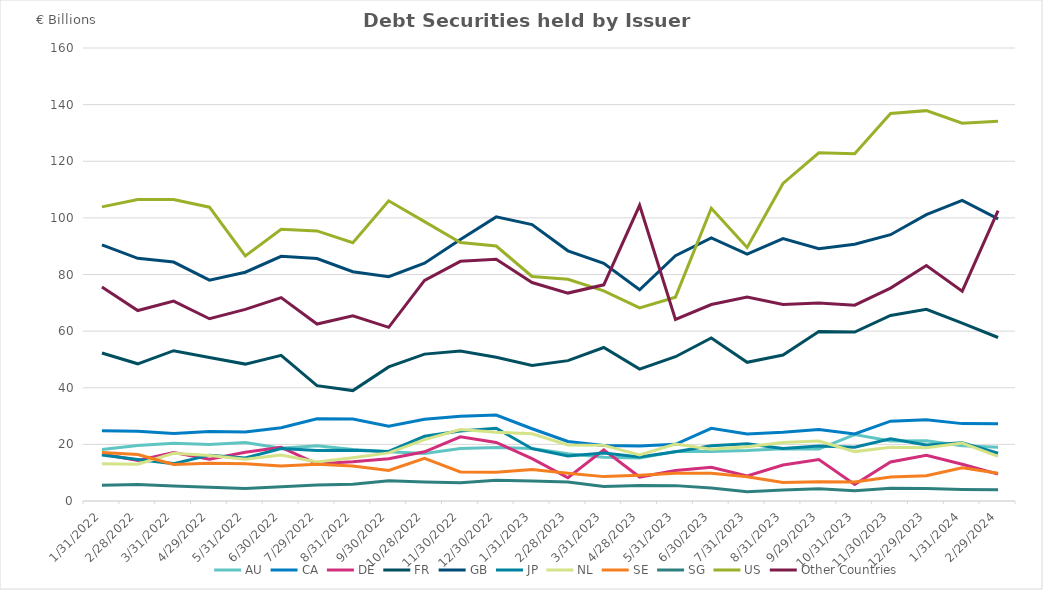
| Category | AU | CA | DE | FR | GB | JP | NL | SE | SG | US | Other Countries |
|---|---|---|---|---|---|---|---|---|---|---|---|
| 1/31/22 | 18.209 | 24.77 | 16.56 | 52.28 | 90.47 | 16.211 | 13.2 | 17.124 | 5.554 | 103.876 | 75.551 |
| 2/28/22 | 19.636 | 24.638 | 14.357 | 48.458 | 85.706 | 14.653 | 13.016 | 16.429 | 5.827 | 106.489 | 67.269 |
| 3/31/22 | 20.436 | 23.839 | 17.113 | 53.081 | 84.395 | 13.205 | 16.839 | 12.868 | 5.311 | 106.45 | 70.583 |
| 4/29/22 | 19.933 | 24.514 | 14.778 | 50.656 | 77.998 | 16.192 | 16.096 | 13.293 | 4.85 | 103.773 | 64.375 |
| 5/31/22 | 20.652 | 24.338 | 17.208 | 48.354 | 80.806 | 15.192 | 14.714 | 13.119 | 4.445 | 86.566 | 67.662 |
| 6/30/22 | 18.61 | 25.868 | 18.938 | 51.448 | 86.443 | 18.526 | 16.257 | 12.352 | 5.066 | 95.959 | 71.852 |
| 7/29/22 | 19.532 | 29.042 | 13.127 | 40.744 | 85.623 | 17.826 | 13.815 | 12.936 | 5.684 | 95.395 | 62.504 |
| 8/31/22 | 18.156 | 28.987 | 13.859 | 39.006 | 80.971 | 17.91 | 15.31 | 12.323 | 5.918 | 91.224 | 65.426 |
| 9/30/22 | 17.425 | 26.424 | 14.923 | 47.346 | 79.199 | 17.516 | 16.99 | 10.763 | 7.112 | 106.025 | 61.343 |
| 10/28/22 | 16.776 | 28.84 | 17.373 | 51.876 | 83.967 | 22.851 | 21.66 | 15.069 | 6.73 | 98.69 | 77.945 |
| 11/30/22 | 18.57 | 29.92 | 22.666 | 52.96 | 92.375 | 24.73 | 25.244 | 10.243 | 6.417 | 91.313 | 84.654 |
| 12/30/22 | 18.926 | 30.336 | 20.699 | 50.76 | 100.348 | 25.693 | 24.296 | 10.143 | 7.356 | 90.057 | 85.362 |
| 1/31/23 | 18.577 | 25.528 | 14.936 | 47.888 | 97.621 | 18.477 | 23.726 | 11.1 | 7.094 | 79.298 | 77.168 |
| 2/28/23 | 16.726 | 21.03 | 8.214 | 49.572 | 88.368 | 15.876 | 19.812 | 9.836 | 6.688 | 78.287 | 73.438 |
| 3/31/23 | 15.452 | 19.622 | 18.07 | 54.211 | 83.96 | 16.953 | 19.647 | 8.611 | 5.095 | 74.195 | 76.351 |
| 4/28/23 | 15.156 | 19.434 | 8.455 | 46.581 | 74.611 | 15.55 | 16.232 | 9.077 | 5.461 | 68.218 | 104.452 |
| 5/31/23 | 17.503 | 20.01 | 10.804 | 50.959 | 86.642 | 17.392 | 20.084 | 9.781 | 5.43 | 71.992 | 64.128 |
| 6/30/23 | 17.474 | 25.687 | 11.898 | 57.568 | 92.919 | 19.503 | 18.31 | 9.787 | 4.565 | 103.409 | 69.389 |
| 7/31/23 | 17.8 | 23.67 | 8.832 | 48.985 | 87.205 | 20.201 | 19.17 | 8.55 | 3.304 | 89.518 | 72.058 |
| 8/31/23 | 18.444 | 24.266 | 12.717 | 51.576 | 92.664 | 18.586 | 20.667 | 6.571 | 3.889 | 112.176 | 69.425 |
| 9/29/23 | 18.338 | 25.283 | 14.639 | 59.903 | 89.072 | 19.388 | 21.162 | 6.809 | 4.286 | 122.971 | 69.898 |
| 10/31/23 | 23.447 | 23.657 | 5.827 | 59.694 | 90.684 | 18.974 | 17.448 | 6.698 | 3.628 | 122.683 | 69.155 |
| 11/30/23 | 21.221 | 28.184 | 13.791 | 65.522 | 94.056 | 21.991 | 18.998 | 8.446 | 4.533 | 136.849 | 75.198 |
| 12/29/23 | 21.247 | 28.662 | 16.13 | 67.732 | 101.157 | 19.781 | 18.848 | 8.924 | 4.453 | 137.875 | 83.161 |
| 1/31/24 | 19.511 | 27.331 | 12.981 | 62.796 | 106.2 | 20.565 | 20.47 | 11.72 | 4.061 | 133.413 | 74.096 |
| 2/29/24 | 19 | 27.287 | 9.511 | 57.743 | 99.676 | 16.847 | 15.773 | 9.766 | 3.935 | 134.155 | 102.585 |